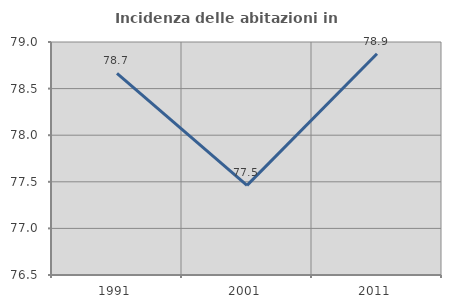
| Category | Incidenza delle abitazioni in proprietà  |
|---|---|
| 1991.0 | 78.663 |
| 2001.0 | 77.462 |
| 2011.0 | 78.873 |